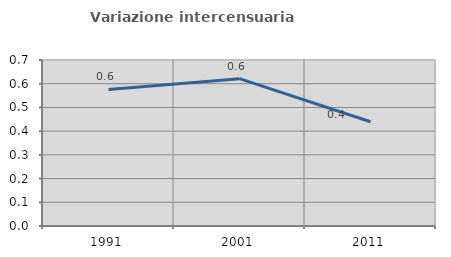
| Category | Variazione intercensuaria annua |
|---|---|
| 1991.0 | 0.576 |
| 2001.0 | 0.621 |
| 2011.0 | 0.44 |